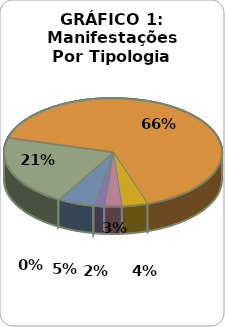
| Category | ABRIL | MAIO | JUNHO |
|---|---|---|---|
| SOLICITAÇÕES | 228 | 214 | 126 |
| RECLAMAÇÕES | 539 | 670 | 349 |
| DENÚNCIAS | 65 | 39 | 4 |
| ELOGIOS | 12 | 26 | 6 |
| SUGESTÕES | 19 | 16 | 3 |
| INFORMAÇÕES | 69 | 56 | 40 |
| DEN/LICITAÇÕES | 0 | 0 | 0 |